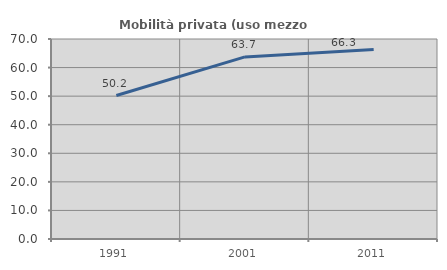
| Category | Mobilità privata (uso mezzo privato) |
|---|---|
| 1991.0 | 50.209 |
| 2001.0 | 63.729 |
| 2011.0 | 66.349 |